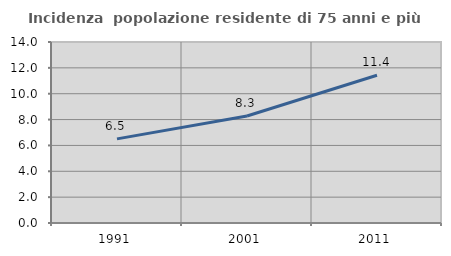
| Category | Incidenza  popolazione residente di 75 anni e più |
|---|---|
| 1991.0 | 6.505 |
| 2001.0 | 8.273 |
| 2011.0 | 11.432 |